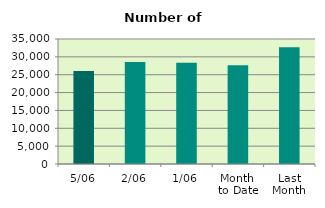
| Category | Series 0 |
|---|---|
| 5/06 | 26044 |
| 2/06 | 28534 |
| 1/06 | 28322 |
| Month 
to Date | 27633.333 |
| Last
Month | 32723.818 |